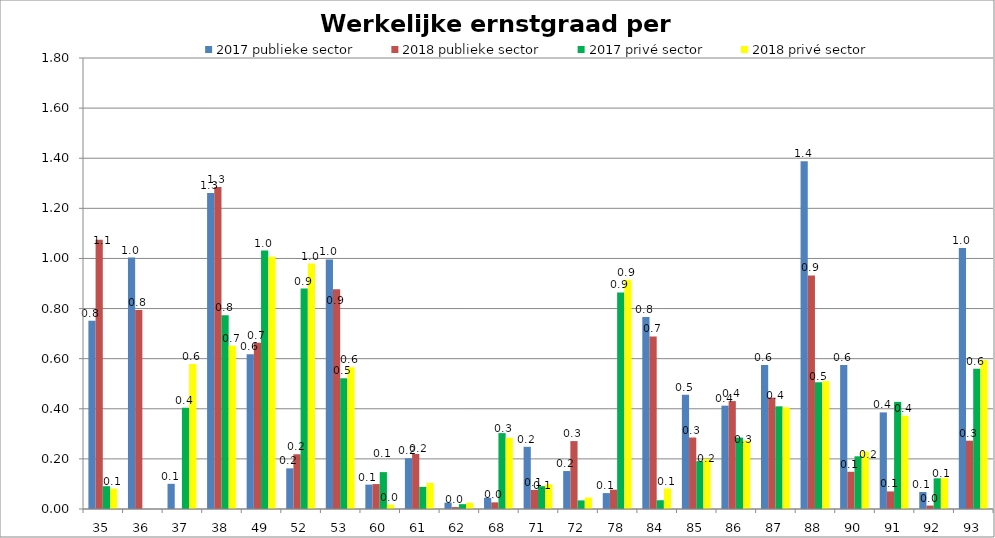
| Category | 2017 publieke sector | 2018 publieke sector | 2017 privé sector | 2018 privé sector |
|---|---|---|---|---|
| 35 | 0.751 | 1.075 | 0.091 | 0.081 |
| 36 | 1.003 | 0.794 | 0 | 0 |
| 37 | 0.1 | 0 | 0.405 | 0.579 |
| 38 | 1.261 | 1.285 | 0.773 | 0.652 |
| 49 | 0.618 | 0.664 | 1.031 | 1.007 |
| 52 | 0.162 | 0.219 | 0.88 | 0.979 |
| 53 | 0.996 | 0.877 | 0.522 | 0.566 |
| 60 | 0.097 | 0.1 | 0.147 | 0.017 |
| 61 | 0.203 | 0.22 | 0.088 | 0.104 |
| 62 | 0.025 | 0.008 | 0.019 | 0.025 |
| 68 | 0.045 | 0.027 | 0.303 | 0.284 |
| 71 | 0.248 | 0.076 | 0.091 | 0.099 |
| 72 | 0.151 | 0.271 | 0.034 | 0.046 |
| 78 | 0.064 | 0.077 | 0.865 | 0.915 |
| 84 | 0.767 | 0.689 | 0.035 | 0.082 |
| 85 | 0.456 | 0.285 | 0.191 | 0.2 |
| 86 | 0.412 | 0.431 | 0.285 | 0.272 |
| 87 | 0.574 | 0.444 | 0.41 | 0.406 |
| 88 | 1.388 | 0.932 | 0.506 | 0.51 |
| 90 | 0.575 | 0.149 | 0.21 | 0.229 |
| 91 | 0.386 | 0.07 | 0.428 | 0.372 |
| 92 | 0.068 | 0.014 | 0.123 | 0.123 |
| 93 | 1.042 | 0.273 | 0.56 | 0.595 |